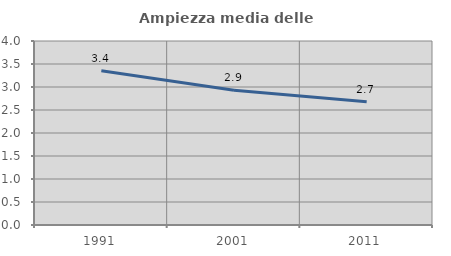
| Category | Ampiezza media delle famiglie |
|---|---|
| 1991.0 | 3.353 |
| 2001.0 | 2.928 |
| 2011.0 | 2.679 |